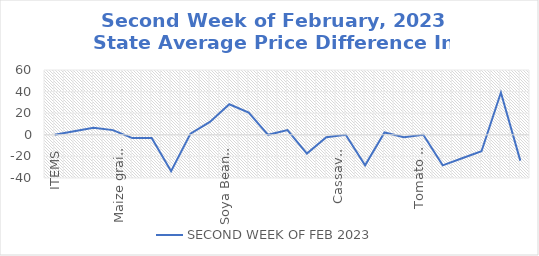
| Category | SECOND WEEK OF FEB 2023 |
|---|---|
| ITEMS | 0 |
| Rice, Imported, High Quality Sold loose  (1 mudu) | 3.261 |
| Rice, Agric Sold Loose(Low quality) imported  (1 mudu) | 6.522 |
| Rice Local, Sold Loose   (1 mudu) | 4.348 |
| Maize grain, white sold loose   (1 mudu) | -3.043 |
| Maize grain, yellow sold loose   (1 mudu) | -3.043 |
| Sorghum (Guinea Corn) white or brown, sold loose   (1 mudu) | -33.696 |
| millet (jero or maiwa) sold loose   (1 mudu) | 1.087 |
| Beans: white black eye. Sold loose   (1 mudu) | 11.957 |
| Beans Brown, sold loose  (1 mudu) | 28.261 |
| Soya Beans, sold loose    (1 mudu) | 20.652 |
| Gari White, sold loose  (1 mudu) | 0 |
| Gari Yellow, sold loose   (1 mudu) | 4.348 |
| Palm oil (1 schnap bottle) | -17.391 |
| Yam tuber (1 Medium Size) | -2.174 |
| Cassava tuber | 0 |
| Irish potato  (4 Litre rubber) | -28.261 |
| Sweet potato  (5 Medium Size) | 2.174 |
| Local live chicken  | -2.174 |
| Groundnut - shelled (fresh) | 0 |
| Tomato fresh   (4 Litre rubber) | -28.261 |
| Okro fresh     (1 mudu) | -21.739 |
| Okro dried    (1 mudu) | -15.217 |
| Onion   (4 Litre rubber) | 39.13 |
| Pepper fresh   (4 Litre rubber) | -23.913 |